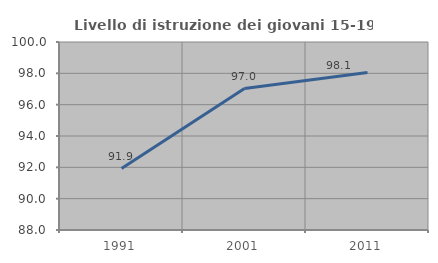
| Category | Livello di istruzione dei giovani 15-19 anni |
|---|---|
| 1991.0 | 91.919 |
| 2001.0 | 97.03 |
| 2011.0 | 98.056 |